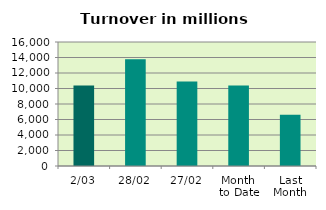
| Category | Series 0 |
|---|---|
| 2/03 | 10381.276 |
| 28/02 | 13766.877 |
| 27/02 | 10914.921 |
| Month 
to Date | 10381.276 |
| Last
Month | 6605.047 |